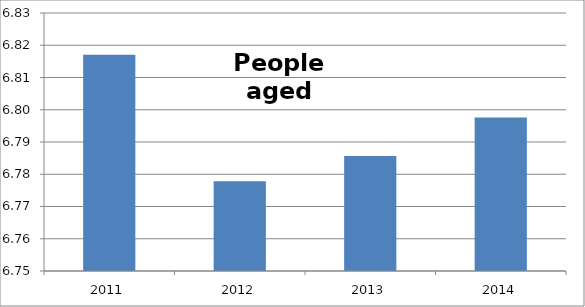
| Category | Series 0 |
|---|---|
| 2011 | 6.817 |
| 2012 | 6.778 |
| 2013 | 6.786 |
| 2014 | 6.798 |